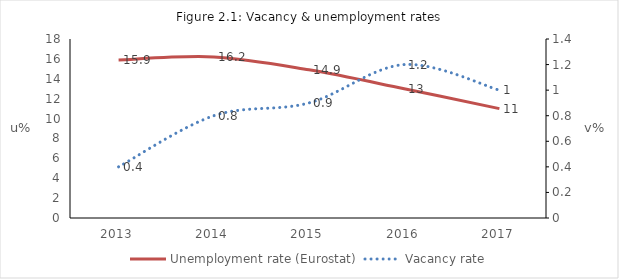
| Category | Unemployment rate (Eurostat) |
|---|---|
| 2013.0 | 15.9 |
| 2014.0 | 16.2 |
| 2015.0 | 14.9 |
| 2016.0 | 13 |
| 2017.0 | 11 |